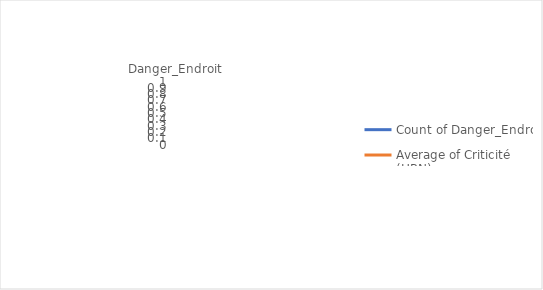
| Category | Count of Danger_Endroit | Average of Criticité  (HRN) |
|---|---|---|
| (blank) |  | 0 |